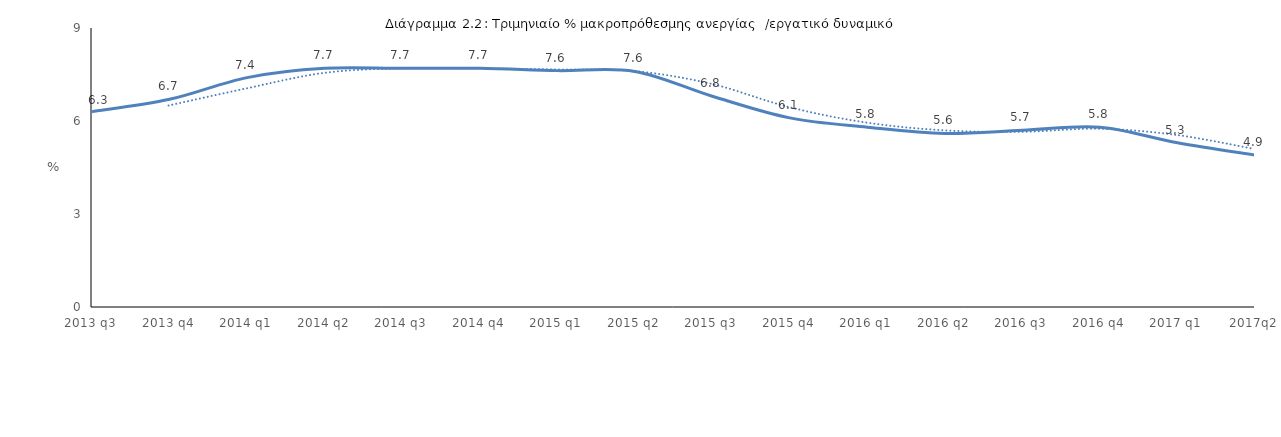
| Category |  >12 μήνες/εργατικό δυναμικό  |
|---|---|
| 2013 q3 | 6.3 |
| 2013 q4 | 6.7 |
| 2014 q1 | 7.4 |
| 2014 q2 | 7.7 |
| 2014 q3 | 7.7 |
| 2014 q4 | 7.7 |
| 2015 q1 | 7.625 |
| 2015 q2 | 7.6 |
| 2015 q3 | 6.8 |
| 2015 q4 | 6.1 |
| 2016 q1 | 5.8 |
| 2016 q2 | 5.6 |
| 2016 q3 | 5.7 |
| 2016 q4 | 5.8 |
| 2017 q1 | 5.3 |
| 2017q2 | 4.9 |